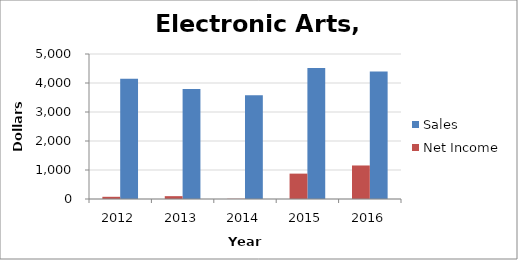
| Category | Sales | Net Income |
|---|---|---|
| 2016.0 | 4396 | 1156 |
| 2015.0 | 4515 | 875 |
| 2014.0 | 3575 | 8 |
| 2013.0 | 3797 | 98 |
| 2012.0 | 4143 | 76 |